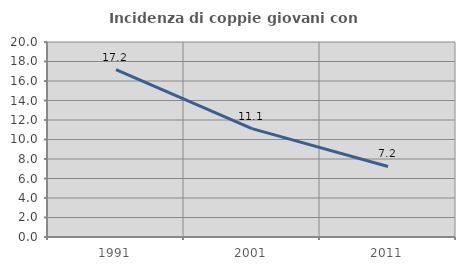
| Category | Incidenza di coppie giovani con figli |
|---|---|
| 1991.0 | 17.176 |
| 2001.0 | 11.111 |
| 2011.0 | 7.234 |